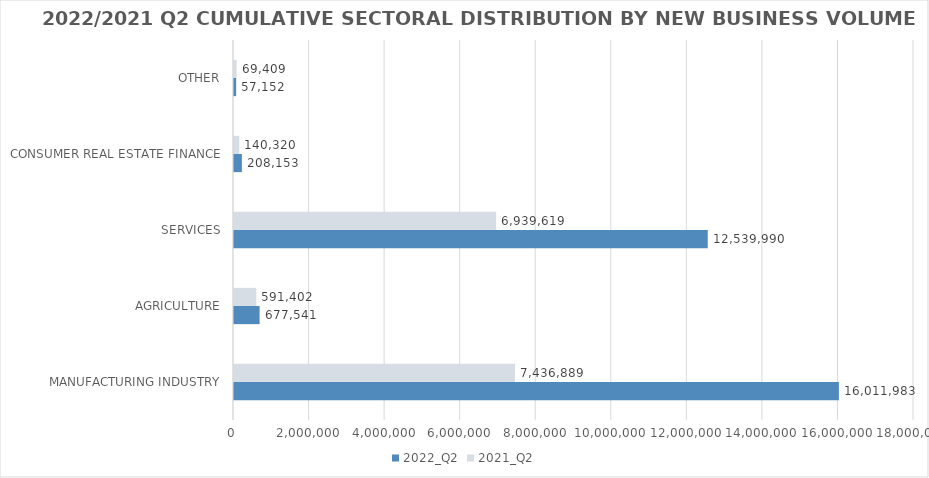
| Category | 2022_Q2 | 2021_Q2 |
|---|---|---|
| MANUFACTURING INDUSTRY | 16011983.02 | 7436889.296 |
| AGRICULTURE | 677541.183 | 591401.888 |
| SERVICES | 12539990.332 | 6939619.239 |
| CONSUMER REAL ESTATE FINANCE | 208153 | 140320 |
| OTHER | 57152 | 69409 |